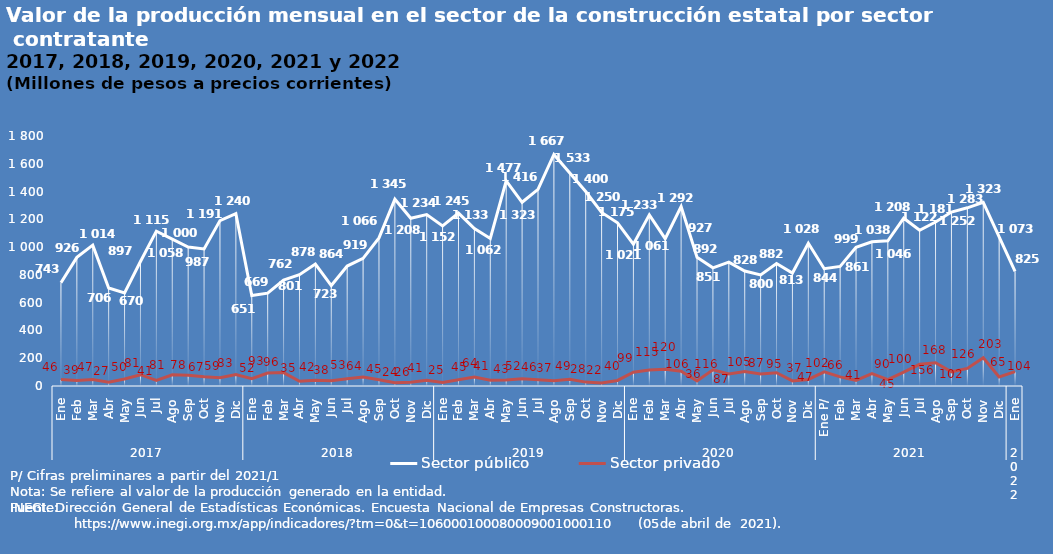
| Category | Sector público | Sector privado |
|---|---|---|
| 0 | 743.356 | 46.453 |
| 1 | 926.029 | 39.007 |
| 2 | 1013.983 | 46.54 |
| 3 | 705.517 | 27.223 |
| 4 | 670.427 | 50.361 |
| 5 | 896.565 | 81.311 |
| 6 | 1114.978 | 40.991 |
| 7 | 1057.996 | 81.207 |
| 8 | 1000.2 | 78.016 |
| 9 | 987.133 | 67.067 |
| 10 | 1191.188 | 58.896 |
| 11 | 1240.453 | 82.67 |
| 12 | 651.13 | 52.09 |
| 13 | 668.744 | 92.81 |
| 14 | 762.488 | 96.38 |
| 15 | 801.489 | 34.591 |
| 16 | 878.419 | 41.802 |
| 17 | 723.427 | 37.655 |
| 18 | 863.526 | 52.98 |
| 19 | 919.377 | 64.252 |
| 20 | 1066.244 | 44.997 |
| 21 | 1344.926 | 23.546 |
| 22 | 1207.896 | 26.375 |
| 23 | 1234.214 | 40.543 |
| 24 | 1152.256 | 24.599 |
| 25 | 1244.992 | 45.058 |
| 26 | 1133.386 | 63.87 |
| 27 | 1062.466 | 40.998 |
| 28 | 1477.337 | 42.506 |
| 29 | 1322.841 | 52.135 |
| 30 | 1416.265 | 45.539 |
| 31 | 1667.447 | 37.378 |
| 32 | 1532.952 | 48.577 |
| 33 | 1399.952 | 27.916 |
| 34 | 1249.726 | 21.748 |
| 35 | 1175.12 | 39.936 |
| 36 | 1021.028 | 99.401 |
| 37 | 1232.631 | 114.864 |
| 38 | 1060.668 | 120.115 |
| 39 | 1292.124 | 106.259 |
| 40 | 927.252 | 36.195 |
| 41 | 850.655 | 116.221 |
| 42 | 892.205 | 86.843 |
| 43 | 827.539 | 104.526 |
| 44 | 799.629 | 86.561 |
| 45 | 882.024 | 95.283 |
| 46 | 813.056 | 36.591 |
| 47 | 1028.078 | 47.34 |
| 48 | 844.297 | 102.234 |
| 49 | 861.03 | 65.536 |
| 50 | 999.042 | 40.797 |
| 51 | 1037.874 | 89.574 |
| 52 | 1045.505 | 45.391 |
| 53 | 1208.291 | 100.177 |
| 54 | 1121.623 | 156.265 |
| 55 | 1181.077 | 167.573 |
| 56 | 1252.434 | 102.112 |
| 57 | 1282.892 | 126.255 |
| 58 | 1322.997 | 203.352 |
| 59 | 1073.03 | 65.232 |
| 60 | 825.245 | 103.684 |